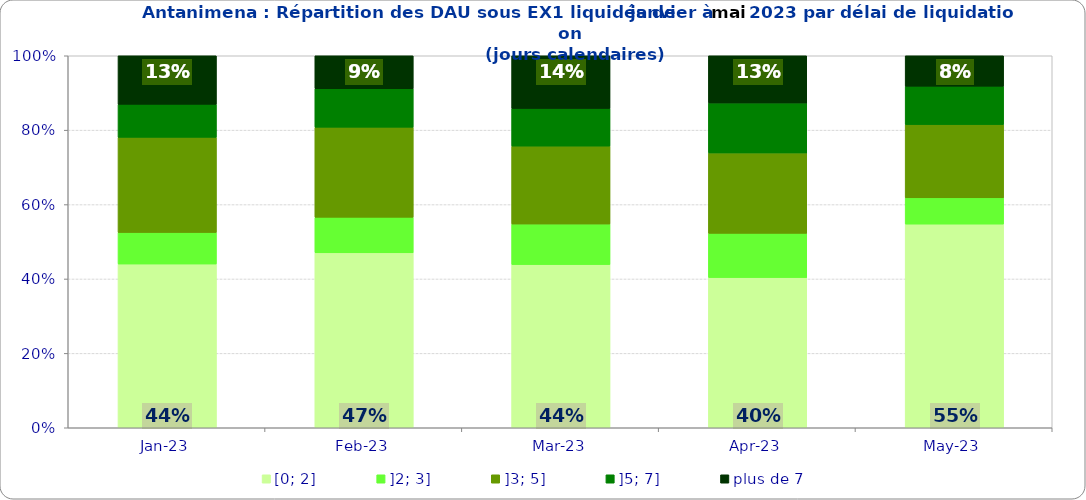
| Category | [0; 2] | ]2; 3] | ]3; 5] | ]5; 7] | plus de 7 |
|---|---|---|---|---|---|
| 2023-01-01 | 0.44 | 0.085 | 0.256 | 0.089 | 0.131 |
| 2023-02-01 | 0.47 | 0.096 | 0.242 | 0.103 | 0.089 |
| 2023-03-01 | 0.439 | 0.109 | 0.209 | 0.101 | 0.142 |
| 2023-04-01 | 0.404 | 0.119 | 0.216 | 0.134 | 0.127 |
| 2023-05-01 | 0.547 | 0.071 | 0.197 | 0.103 | 0.082 |